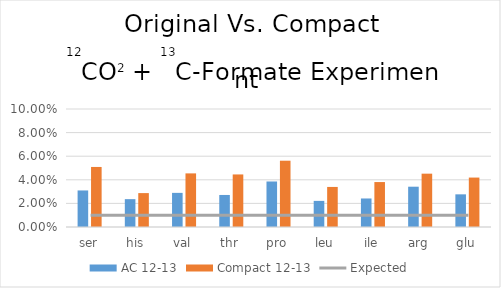
| Category | AC 12-13 | Compact 12-13 |
|---|---|---|
| ser | 0.031 | 0.051 |
| his | 0.024 | 0.029 |
| val | 0.029 | 0.045 |
| thr | 0.027 | 0.045 |
| pro | 0.039 | 0.056 |
| leu | 0.022 | 0.034 |
| ile | 0.024 | 0.038 |
| arg | 0.034 | 0.045 |
| glu | 0.028 | 0.042 |